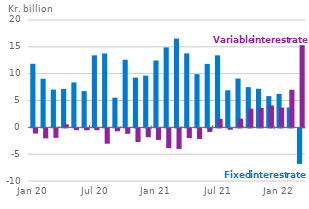
| Category | Fixed interest rate | Variable interest rate  |
|---|---|---|
| 2020-01-01 | 11.835 | -0.969 |
| 2020-02-01 | 9.062 | -1.872 |
| 2020-03-01 | 7.034 | -1.764 |
| 2020-04-01 | 7.151 | 0.574 |
| 2020-05-01 | 8.371 | -0.345 |
| 2020-06-01 | 6.747 | -0.368 |
| 2020-07-01 | 13.421 | -0.352 |
| 2020-08-01 | 13.765 | -2.868 |
| 2020-09-01 | 5.529 | -0.549 |
| 2020-10-01 | 12.594 | -1.019 |
| 2020-11-01 | 9.265 | -2.55 |
| 2020-12-01 | 9.634 | -1.652 |
| 2021-01-01 | 12.455 | -2.163 |
| 2021-02-01 | 14.891 | -3.681 |
| 2021-03-01 | 16.525 | -3.841 |
| 2021-04-01 | 13.777 | -1.802 |
| 2021-05-01 | 9.915 | -1.98 |
| 2021-06-01 | 11.825 | -0.667 |
| 2021-07-01 | 13.424 | 1.583 |
| 2021-08-01 | 6.905 | -0.252 |
| 2021-09-01 | 9.095 | 1.619 |
| 2021-10-01 | 7.484 | 3.475 |
| 2021-11-01 | 7.188 | 3.604 |
| 2021-12-01 | 5.825 | 4.084 |
| 2022-01-01 | 6.242 | 3.673 |
| 2022-02-01 | 3.708 | 7.001 |
| 2022-03-01 | -6.634 | 15.313 |